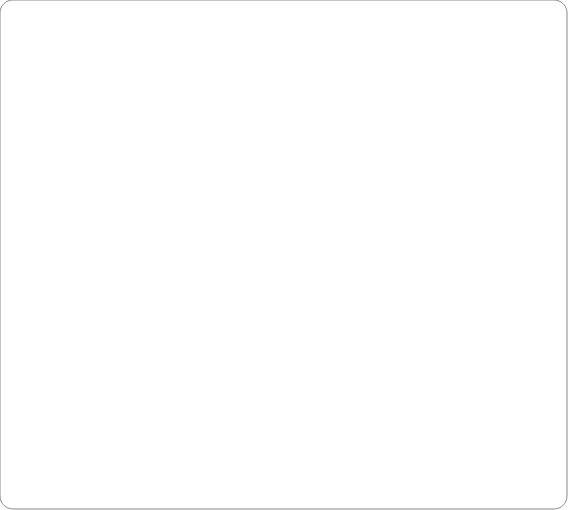
| Category | BUDGET |
|---|---|
| EMPLOYMENT - PERMANENT | 0 |
| EMPLOYMENT - CASUAL | 0 |
| GENERAL/ADMIN | 0 |
| OPERATIONS | 0 |
| MARKETING/PROMO | 0 |
| WEBSITE/MOBILE APP | 0 |
| OCCUPANCY | 0 |
| AUTOMOTIVE | 0 |
| ADDITIONAL | 0 |